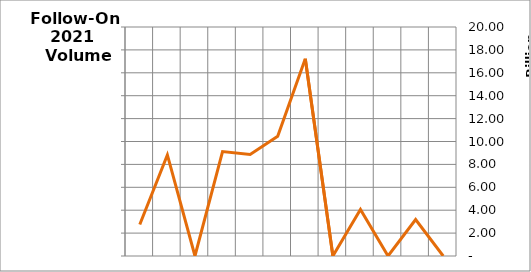
| Category | Volume (R$) |
|---|---|
| Janeiro | 2744850560 |
| Fevereiro | 8828197752.56 |
| Março | 0 |
| Abril | 9115841325 |
| Maio | 8867060000 |
| Junho | 10447727290.24 |
| Julho | 17220953368 |
| Agosto | 0 |
| Setembro | 4057747347.5 |
| Outubro | 0 |
| Novembro | 3188000000 |
| Dezembro | 0 |